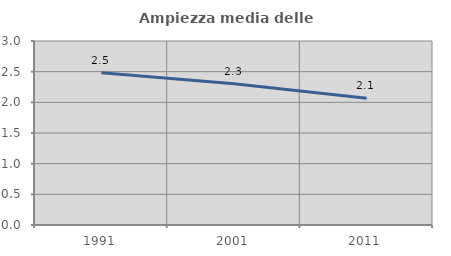
| Category | Ampiezza media delle famiglie |
|---|---|
| 1991.0 | 2.481 |
| 2001.0 | 2.303 |
| 2011.0 | 2.067 |